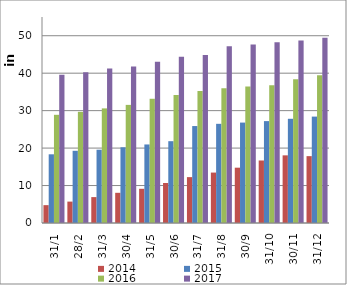
| Category | 2014 | 2015 | 2016 | 2017 |
|---|---|---|---|---|
| 31/1 | 4765 | 18341 | 28886 | 39595 |
| 28/2 | 5714 | 19278 | 29684 | 40260 |
| 31/3 | 6914 | 19564 | 30602 | 41220 |
| 30/4 | 8061 | 20217 | 31534 | 41783 |
| 31/5 | 9132 | 20970 | 33168 | 43082 |
| 30/6 | 10683 | 21843 | 34200 | 44387 |
| 31/7 | 12248 | 25885 | 35239 | 44864 |
| 31/8 | 13464 | 26480 | 35983 | 47191 |
| 30/9 | 14770 | 26811 | 36419 | 47669 |
| 31/10 | 16691 | 27205 | 36774 | 48229 |
| 30/11 | 18062 | 27824 | 38396 | 48750 |
| 31/12 | 17851 | 28407 | 39458 | 49476 |